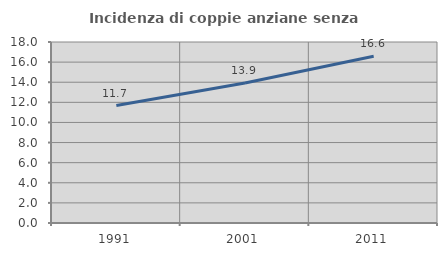
| Category | Incidenza di coppie anziane senza figli  |
|---|---|
| 1991.0 | 11.684 |
| 2001.0 | 13.918 |
| 2011.0 | 16.589 |